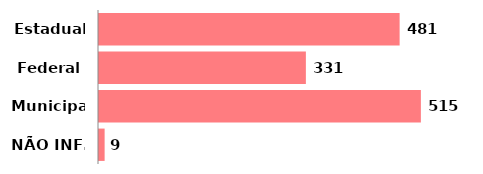
| Category | Qtde |
|---|---|
| Estadual | 481 |
| Federal | 331 |
| Municipal | 515 |
| NÃO INF. | 9 |